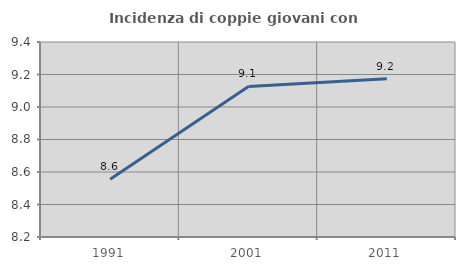
| Category | Incidenza di coppie giovani con figli |
|---|---|
| 1991.0 | 8.555 |
| 2001.0 | 9.126 |
| 2011.0 | 9.174 |